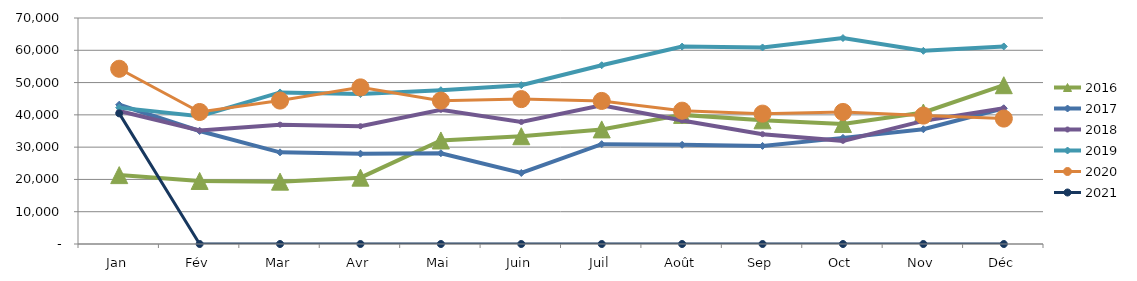
| Category | 2015 | 2016 | 2017 | 2018 | 2019 | 2020 | 2021 |
|---|---|---|---|---|---|---|---|
| Jan |  | 21335.134 | 43138.429 | 41189.736 | 42238.432 | 54273.068 | 40458.51 |
| Fév |  | 19532.337 | 35009.004 | 35137.047 | 39568.195 | 40883.319 | 0 |
| Mar |  | 19313.57 | 28389.673 | 36966.816 | 46942.202 | 44426.392 | 0 |
| Avr |  | 20550.618 | 27972.802 | 36485.223 | 46427.766 | 48509.843 | 0 |
| Mai |  | 32066.609 | 28116.194 | 41558.724 | 47634.031 | 44407.424 | 0 |
| Juin |  | 33383.309 | 22002.869 | 37797.134 | 49186.221 | 44874.513 | 0 |
| Juil |  | 35495.63 | 30926.131 | 42927.847 | 55367.883 | 44316.236 | 0 |
| Août |  | 39992.765 | 30717.708 | 38263.165 | 61146.365 | 41285.559 | 0 |
| Sep |  | 38306.611 | 30378.863 | 34011.672 | 60874.85 | 40379.909 | 0 |
| Oct |  | 37188.976 | 32868.78 | 31946.792 | 63789.634 | 40903.528 | 0 |
| Nov |  | 40729.636 | 35537.079 | 38139.513 | 59829.208 | 39772.437 | 0 |
| Déc |  | 49180.232 | 42040.249 | 42064.579 | 61190.831 | 38851.183 | 0 |